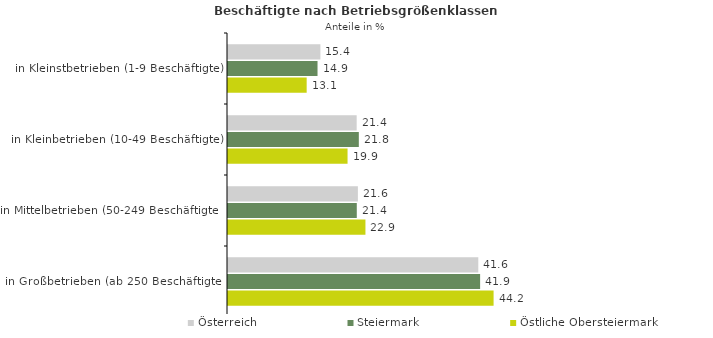
| Category | Österreich | Steiermark | Östliche Obersteiermark |
|---|---|---|---|
| in Kleinstbetrieben (1-9 Beschäftigte) | 15.366 | 14.89 | 13.084 |
| in Kleinbetrieben (10-49 Beschäftigte) | 21.402 | 21.759 | 19.883 |
| in Mittelbetrieben (50-249 Beschäftigte) | 21.603 | 21.42 | 22.859 |
| in Großbetrieben (ab 250 Beschäftigte) | 41.629 | 41.932 | 44.173 |